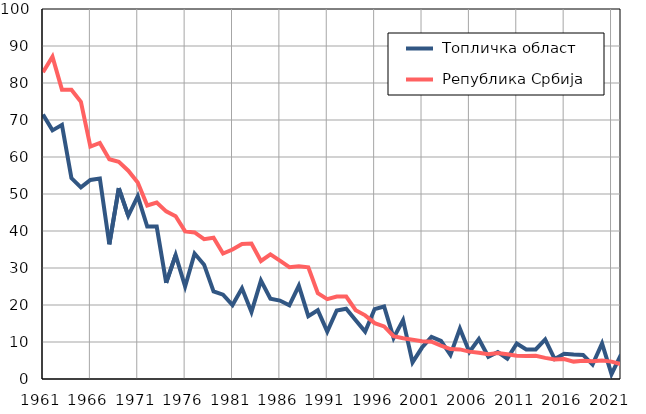
| Category |  Топличка област |  Република Србија |
|---|---|---|
| 1961.0 | 71.5 | 82.9 |
| 1962.0 | 67.2 | 87.1 |
| 1963.0 | 68.7 | 78.2 |
| 1964.0 | 54.3 | 78.2 |
| 1965.0 | 51.8 | 74.9 |
| 1966.0 | 53.8 | 62.8 |
| 1967.0 | 54.2 | 63.8 |
| 1968.0 | 36.4 | 59.4 |
| 1969.0 | 51.6 | 58.7 |
| 1970.0 | 44.1 | 56.3 |
| 1971.0 | 49.4 | 53.1 |
| 1972.0 | 41.2 | 46.9 |
| 1973.0 | 41.2 | 47.7 |
| 1974.0 | 26 | 45.3 |
| 1975.0 | 33.5 | 44 |
| 1976.0 | 25 | 39.9 |
| 1977.0 | 33.9 | 39.6 |
| 1978.0 | 30.9 | 37.8 |
| 1979.0 | 23.7 | 38.2 |
| 1980.0 | 22.8 | 33.9 |
| 1981.0 | 20 | 35 |
| 1982.0 | 24.5 | 36.5 |
| 1983.0 | 18.1 | 36.6 |
| 1984.0 | 26.6 | 31.9 |
| 1985.0 | 21.7 | 33.7 |
| 1986.0 | 21.2 | 32 |
| 1987.0 | 19.9 | 30.2 |
| 1988.0 | 25.2 | 30.5 |
| 1989.0 | 17 | 30.2 |
| 1990.0 | 18.6 | 23.2 |
| 1991.0 | 12.8 | 21.6 |
| 1992.0 | 18.5 | 22.3 |
| 1993.0 | 19 | 22.3 |
| 1994.0 | 15.9 | 18.6 |
| 1995.0 | 12.8 | 17.2 |
| 1996.0 | 18.9 | 15.1 |
| 1997.0 | 19.6 | 14.2 |
| 1998.0 | 11.1 | 11.6 |
| 1999.0 | 15.9 | 11 |
| 2000.0 | 4.5 | 10.6 |
| 2001.0 | 8.5 | 10.2 |
| 2002.0 | 11.4 | 10.1 |
| 2003.0 | 10.3 | 9 |
| 2004.0 | 6.5 | 8.1 |
| 2005.0 | 13.6 | 8 |
| 2006.0 | 7.3 | 7.4 |
| 2007.0 | 10.8 | 7.1 |
| 2008.0 | 6 | 6.7 |
| 2009.0 | 7.3 | 7 |
| 2010.0 | 5.5 | 6.7 |
| 2011.0 | 9.6 | 6.3 |
| 2012.0 | 8 | 6.2 |
| 2013.0 | 8 | 6.3 |
| 2014.0 | 10.7 | 5.7 |
| 2015.0 | 5.4 | 5.3 |
| 2016.0 | 6.8 | 5.4 |
| 2017.0 | 6.6 | 4.7 |
| 2018.0 | 6.5 | 4.9 |
| 2019.0 | 3.9 | 4.8 |
| 2020.0 | 9.6 | 5 |
| 2021.0 | 1.3 | 4.7 |
| 2022.0 | 6.6 | 4 |